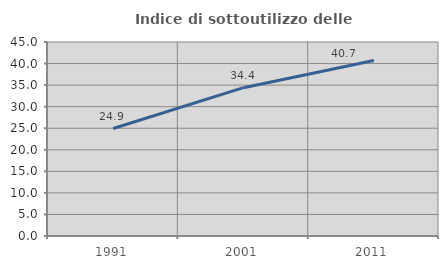
| Category | Indice di sottoutilizzo delle abitazioni  |
|---|---|
| 1991.0 | 24.932 |
| 2001.0 | 34.408 |
| 2011.0 | 40.702 |